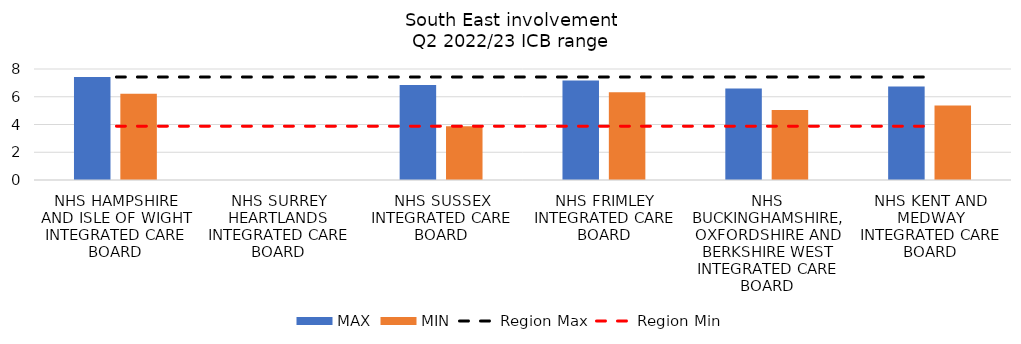
| Category | MAX | MIN |
|---|---|---|
| NHS HAMPSHIRE AND ISLE OF WIGHT INTEGRATED CARE BOARD | 7.423 | 6.221 |
| NHS SURREY HEARTLANDS INTEGRATED CARE BOARD | 0 | 0 |
| NHS SUSSEX INTEGRATED CARE BOARD | 6.843 | 3.881 |
| NHS FRIMLEY INTEGRATED CARE BOARD | 7.176 | 6.326 |
| NHS BUCKINGHAMSHIRE, OXFORDSHIRE AND BERKSHIRE WEST INTEGRATED CARE BOARD | 6.601 | 5.042 |
| NHS KENT AND MEDWAY INTEGRATED CARE BOARD | 6.739 | 5.366 |